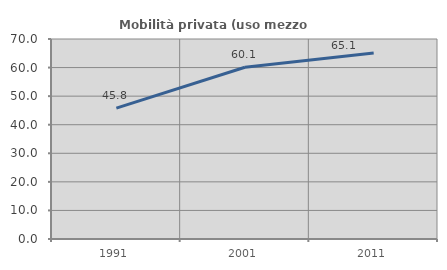
| Category | Mobilità privata (uso mezzo privato) |
|---|---|
| 1991.0 | 45.811 |
| 2001.0 | 60.107 |
| 2011.0 | 65.11 |